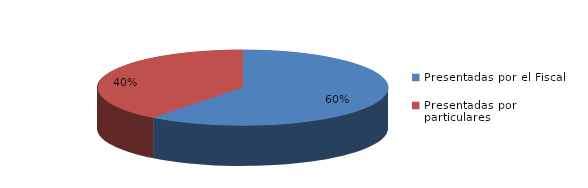
| Category | Series 0 |
|---|---|
| Presentadas por el Fiscal | 52 |
| Presentadas por particulares | 34 |